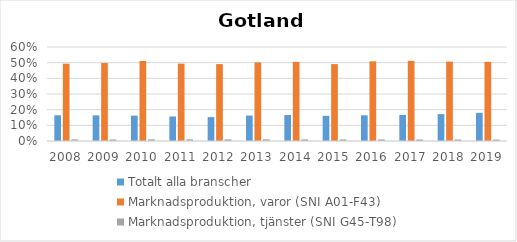
| Category | Totalt alla branscher | Marknadsproduktion, varor (SNI A01-F43) | Marknadsproduktion, tjänster (SNI G45-T98) |
|---|---|---|---|
| 2008 | 0.164 | 0.494 | 0.01 |
| 2009 | 0.164 | 0.498 | 0.01 |
| 2010 | 0.162 | 0.511 | 0.011 |
| 2011 | 0.157 | 0.494 | 0.011 |
| 2012 | 0.153 | 0.491 | 0.011 |
| 2013 | 0.162 | 0.502 | 0.011 |
| 2014 | 0.166 | 0.505 | 0.01 |
| 2015 | 0.16 | 0.491 | 0.01 |
| 2016 | 0.164 | 0.509 | 0.01 |
| 2017 | 0.167 | 0.512 | 0.01 |
| 2018 | 0.172 | 0.507 | 0.01 |
| 2019 | 0.18 | 0.505 | 0.009 |